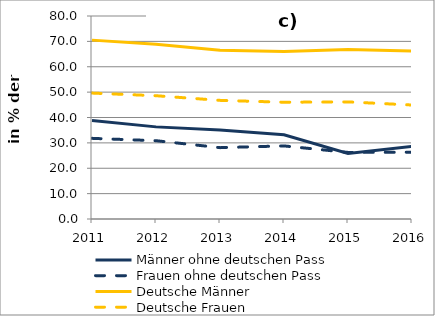
| Category | Männer ohne deutschen Pass | Frauen ohne deutschen Pass | Deutsche Männer | Deutsche Frauen |
|---|---|---|---|---|
| 2011.0 | 38.839 | 31.784 | 70.492 | 49.626 |
| 2012.0 | 36.306 | 30.855 | 68.907 | 48.586 |
| 2013.0 | 35.061 | 28.123 | 66.463 | 46.75 |
| 2014.0 | 33.192 | 28.805 | 66.015 | 46.021 |
| 2015.0 | 25.794 | 26.241 | 66.818 | 46.146 |
| 2016.0 | 28.654 | 26.319 | 66.172 | 44.919 |